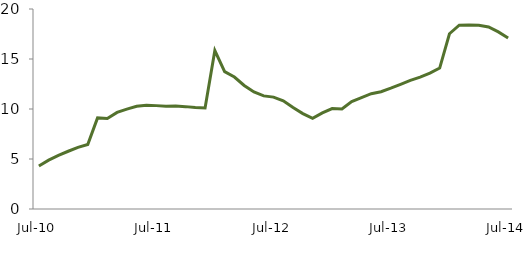
| Category | Series 0 |
|---|---|
| Jul-10 | 4.296 |
|  | 4.885 |
|  | 5.365 |
|  | 5.775 |
|  | 6.16 |
|  | 6.454 |
|  | 9.112 |
|  | 9.055 |
|  | 9.664 |
|  | 9.991 |
|  | 10.267 |
|  | 10.363 |
| Jul-11 | 10.338 |
|  | 10.273 |
|  | 10.288 |
|  | 10.237 |
|  | 10.151 |
|  | 10.1 |
|  | 15.839 |
|  | 13.738 |
|  | 13.199 |
|  | 12.351 |
|  | 11.706 |
|  | 11.314 |
| Jul-12 | 11.188 |
|  | 10.816 |
|  | 10.141 |
|  | 9.544 |
|  | 9.067 |
|  | 9.616 |
|  | 10.045 |
|  | 10.013 |
|  | 10.751 |
|  | 11.131 |
|  | 11.532 |
|  | 11.724 |
| Jul-13 | 12.082 |
|  | 12.472 |
|  | 12.86 |
|  | 13.193 |
|  | 13.59 |
|  | 14.096 |
|  | 17.526 |
|  | 18.377 |
|  | 18.389 |
|  | 18.378 |
|  | 18.197 |
|  | 17.708 |
| Jul-14 | 17.106 |